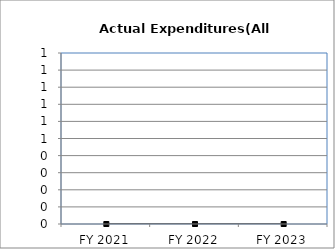
| Category | Actual Expenditures(All Funds) |
|---|---|
| FY 2021 | 0 |
| FY 2022 | 0 |
| FY 2023 | 0 |